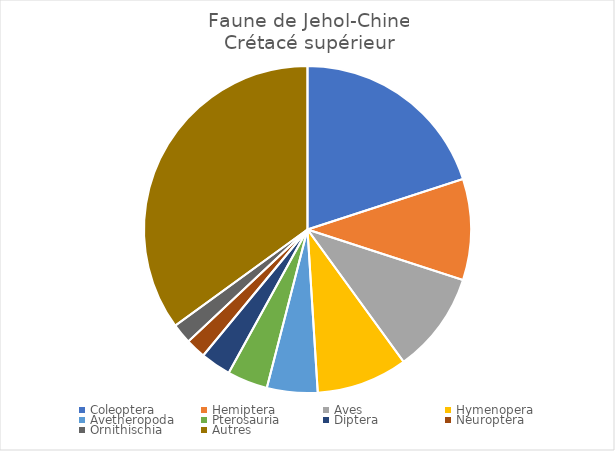
| Category | Series 0 |
|---|---|
| Coleoptera | 0.2 |
| Hemiptera | 0.1 |
| Aves | 0.1 |
| Hymenopera | 0.09 |
| Avetheropoda | 0.05 |
| Pterosauria | 0.04 |
| Diptera | 0.03 |
| Neuroptera | 0.02 |
| Ornithischia | 0.02 |
| Autres | 0.35 |